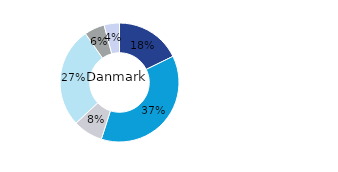
| Category | Danmark |
|---|---|
| Kontor | 0.178 |
| Bostäder | 0.372 |
| Handel | 0.081 |
| Logistik* | 0.273 |
| Samhällsfastigheter | 0.055 |
| Övrigt | 0.042 |